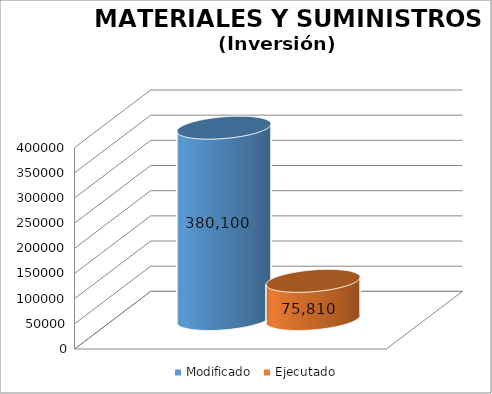
| Category | Modificado | Ejecutado |
|---|---|---|
| 0 | 380100 | 75809.87 |